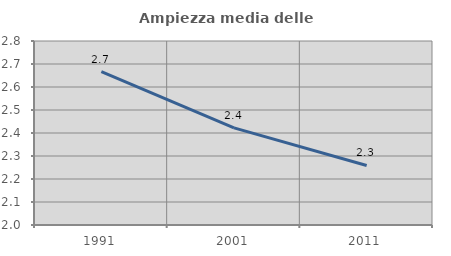
| Category | Ampiezza media delle famiglie |
|---|---|
| 1991.0 | 2.667 |
| 2001.0 | 2.422 |
| 2011.0 | 2.259 |